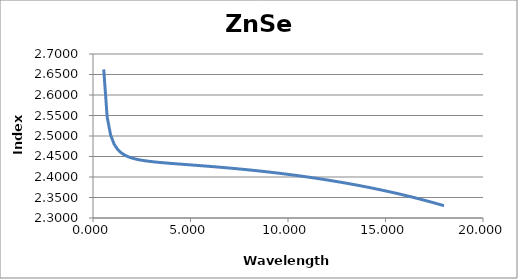
| Category | ZnSe |
|---|---|
| 0.55 | 2.662 |
| 0.7262626 | 2.546 |
| 0.9025253 | 2.503 |
| 1.078788 | 2.481 |
| 1.255051 | 2.468 |
| 1.431313 | 2.46 |
| 1.607576 | 2.454 |
| 1.783838 | 2.45 |
| 1.960101 | 2.447 |
| 2.136364 | 2.444 |
| 2.312626 | 2.443 |
| 2.488889 | 2.441 |
| 2.665152 | 2.44 |
| 2.841414 | 2.438 |
| 3.017677 | 2.437 |
| 3.193939 | 2.437 |
| 3.370202 | 2.436 |
| 3.546465 | 2.435 |
| 3.722727 | 2.434 |
| 3.89899 | 2.434 |
| 4.075253 | 2.433 |
| 4.251515 | 2.432 |
| 4.427778 | 2.432 |
| 4.60404 | 2.431 |
| 4.780303 | 2.43 |
| 4.956566 | 2.43 |
| 5.132828 | 2.429 |
| 5.309091 | 2.428 |
| 5.485354 | 2.428 |
| 5.661616 | 2.427 |
| 5.837879 | 2.426 |
| 6.014141 | 2.426 |
| 6.190404 | 2.425 |
| 6.366667 | 2.424 |
| 6.542929 | 2.424 |
| 6.719192 | 2.423 |
| 6.895455 | 2.422 |
| 7.071717 | 2.422 |
| 7.24798 | 2.421 |
| 7.424242 | 2.42 |
| 7.600505 | 2.419 |
| 7.776768 | 2.418 |
| 7.95303 | 2.418 |
| 8.129293 | 2.417 |
| 8.305556 | 2.416 |
| 8.481818 | 2.415 |
| 8.658081 | 2.414 |
| 8.834343 | 2.413 |
| 9.010606 | 2.412 |
| 9.186869 | 2.411 |
| 9.363131 | 2.41 |
| 9.539394 | 2.409 |
| 9.715657 | 2.408 |
| 9.891919 | 2.407 |
| 10.06818 | 2.406 |
| 10.24444 | 2.405 |
| 10.42071 | 2.404 |
| 10.59697 | 2.403 |
| 10.77323 | 2.402 |
| 10.94949 | 2.4 |
| 11.12576 | 2.399 |
| 11.30202 | 2.398 |
| 11.47828 | 2.397 |
| 11.65455 | 2.395 |
| 11.83081 | 2.394 |
| 12.00707 | 2.393 |
| 12.18333 | 2.391 |
| 12.3596 | 2.39 |
| 12.53586 | 2.389 |
| 12.71212 | 2.387 |
| 12.88838 | 2.386 |
| 13.06465 | 2.384 |
| 13.24091 | 2.383 |
| 13.41717 | 2.381 |
| 13.59343 | 2.38 |
| 13.7697 | 2.378 |
| 13.94596 | 2.376 |
| 14.12222 | 2.375 |
| 14.29848 | 2.373 |
| 14.47475 | 2.371 |
| 14.65101 | 2.37 |
| 14.82727 | 2.368 |
| 15.00354 | 2.366 |
| 15.1798 | 2.364 |
| 15.35606 | 2.362 |
| 15.53232 | 2.36 |
| 15.70859 | 2.359 |
| 15.88485 | 2.357 |
| 16.06111 | 2.355 |
| 16.23737 | 2.352 |
| 16.41364 | 2.35 |
| 16.5899 | 2.348 |
| 16.76616 | 2.346 |
| 16.94242 | 2.344 |
| 17.11869 | 2.342 |
| 17.29495 | 2.339 |
| 17.47121 | 2.337 |
| 17.64747 | 2.335 |
| 17.82374 | 2.332 |
| 18.0 | 2.33 |